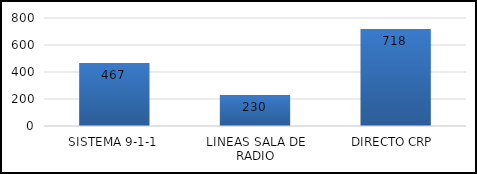
| Category | TOTAL |
|---|---|
| SISTEMA 9-1-1 | 467 |
| LINEAS SALA DE RADIO | 230 |
| DIRECTO CRP  | 718 |